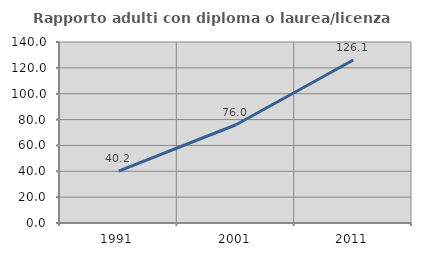
| Category | Rapporto adulti con diploma o laurea/licenza media  |
|---|---|
| 1991.0 | 40.199 |
| 2001.0 | 75.985 |
| 2011.0 | 126.07 |